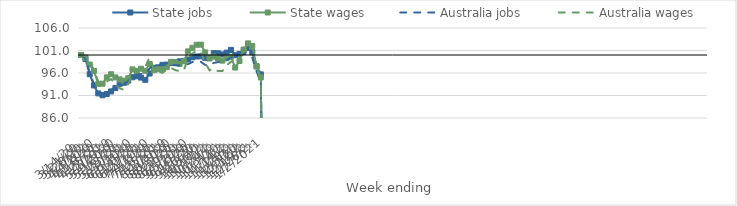
| Category | State jobs | State wages | Australia jobs | Australia wages |
|---|---|---|---|---|
| 14/03/2020 | 100 | 100 | 100 | 100 |
| 21/03/2020 | 99.114 | 99.422 | 99.218 | 99.669 |
| 28/03/2020 | 95.728 | 97.882 | 96.159 | 98.38 |
| 04/04/2020 | 93.236 | 96.47 | 93.511 | 96.663 |
| 11/04/2020 | 91.467 | 93.573 | 91.845 | 94.08 |
| 18/04/2020 | 91.052 | 93.621 | 91.454 | 93.993 |
| 25/04/2020 | 91.343 | 95.031 | 91.82 | 94.131 |
| 02/05/2020 | 91.904 | 95.726 | 92.24 | 94.625 |
| 09/05/2020 | 92.647 | 95.025 | 92.814 | 93.438 |
| 16/05/2020 | 93.591 | 94.58 | 93.355 | 92.628 |
| 23/05/2020 | 93.83 | 94.276 | 93.675 | 92.257 |
| 30/05/2020 | 94.298 | 94.839 | 94.182 | 93.555 |
| 06/06/2020 | 95.059 | 96.813 | 95.129 | 95.487 |
| 13/06/2020 | 95.274 | 96.47 | 95.64 | 96.179 |
| 20/06/2020 | 94.973 | 96.951 | 95.803 | 97.167 |
| 27/06/2020 | 94.481 | 96.486 | 95.768 | 97.377 |
| 04/07/2020 | 95.891 | 98.022 | 97.026 | 99.465 |
| 11/07/2020 | 97.16 | 96.61 | 97.722 | 96.839 |
| 18/07/2020 | 97.266 | 96.84 | 97.64 | 96.355 |
| 25/07/2020 | 97.823 | 96.841 | 97.768 | 96.035 |
| 01/08/2020 | 97.863 | 97.296 | 97.912 | 96.762 |
| 08/08/2020 | 98.208 | 98.484 | 97.848 | 97.159 |
| 15/08/2020 | 98.383 | 98.365 | 97.715 | 96.636 |
| 22/08/2020 | 98.598 | 98 | 97.726 | 96.439 |
| 29/08/2020 | 98.698 | 98.601 | 97.792 | 96.622 |
| 05/09/2020 | 99.002 | 100.811 | 97.988 | 99.323 |
| 12/09/2020 | 99.481 | 101.599 | 98.415 | 100.272 |
| 19/09/2020 | 99.671 | 102.279 | 98.579 | 101.043 |
| 26/09/2020 | 99.7 | 102.3 | 98.452 | 100.421 |
| 03/10/2020 | 99.351 | 100.575 | 97.813 | 98.297 |
| 10/10/2020 | 99.425 | 99.215 | 97.688 | 96.578 |
| 17/10/2020 | 100.414 | 99.628 | 98.252 | 97.02 |
| 24/10/2020 | 100.376 | 99.226 | 98.419 | 96.422 |
| 31/10/2020 | 100.132 | 98.751 | 98.499 | 96.422 |
| 07/11/2020 | 100.533 | 99.269 | 98.826 | 97.695 |
| 14/11/2020 | 101.139 | 99.612 | 99.425 | 98.506 |
| 21/11/2020 | 99.95 | 97.21 | 99.648 | 98.519 |
| 28/11/2020 | 100.249 | 98.654 | 99.873 | 99.566 |
| 05/12/2020 | 101.077 | 101.231 | 100.204 | 100.773 |
| 12/12/2020 | 101.539 | 102.58 | 100.228 | 101.122 |
| 19/12/2020 | 100.622 | 102.005 | 99.39 | 101.653 |
| 26/12/2020 | 97.509 | 97.438 | 96.352 | 97.474 |
| 02/01/2021 | 95.7 | 95.011 | 93.927 | 93.755 |